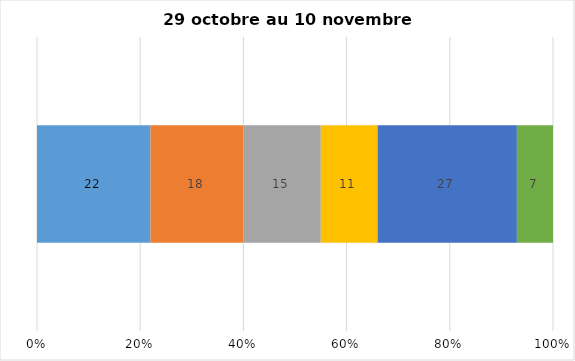
| Category | Plusieurs fois par jour | Une fois par jour | Quelques fois par semaine   | Une fois par semaine ou moins   |  Jamais   |  Je n’utilise pas les médias sociaux |
|---|---|---|---|---|---|---|
| 0 | 22 | 18 | 15 | 11 | 27 | 7 |